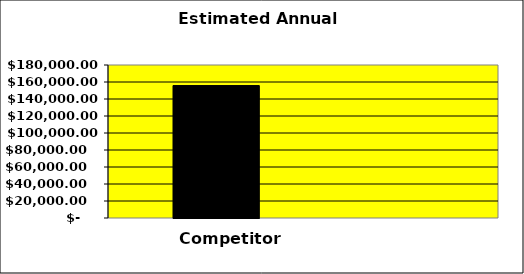
| Category | Series 0 | Series 1 | Series 2 |
|---|---|---|---|
| 0 | 155828.125 |  | 0 |